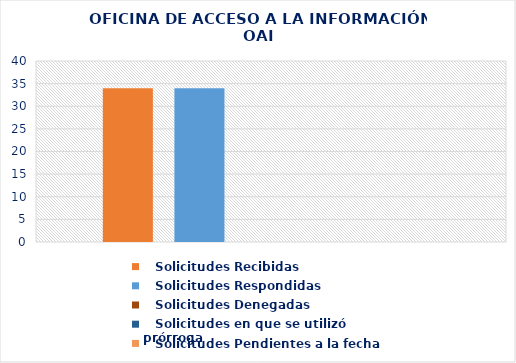
| Category |    Solicitudes Recibidas |    Solicitudes Respondidas |    Solicitudes Denegadas |    Solicitudes en que se utilizó prórroga |    Solicitudes Pendientes a la fecha |
|---|---|---|---|---|---|
| 0 | 34 | 34 | 0 | 0 | 0 |